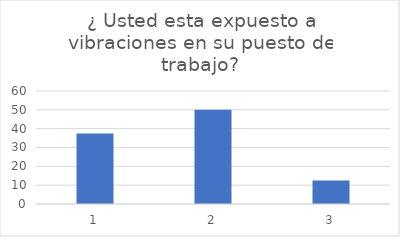
| Category | ¿ Usted esta expuesto a vibraciones en su puesto de trabajo? |
|---|---|
| 0 | 37.5 |
| 1 | 50 |
| 2 | 12.5 |